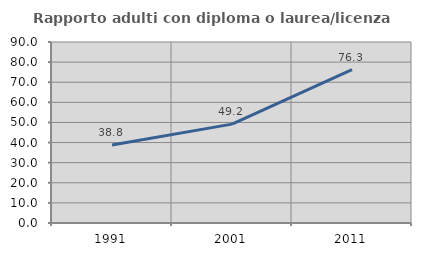
| Category | Rapporto adulti con diploma o laurea/licenza media  |
|---|---|
| 1991.0 | 38.781 |
| 2001.0 | 49.164 |
| 2011.0 | 76.272 |